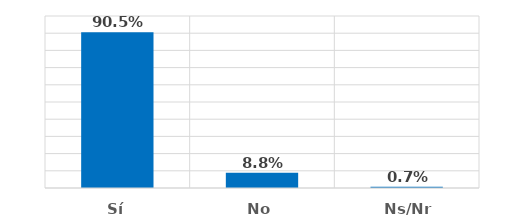
| Category | Series 0 |
|---|---|
| Sí | 0.905 |
| No | 0.088 |
| Ns/Nr | 0.007 |